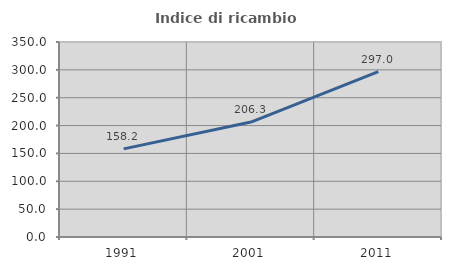
| Category | Indice di ricambio occupazionale  |
|---|---|
| 1991.0 | 158.182 |
| 2001.0 | 206.349 |
| 2011.0 | 297.015 |